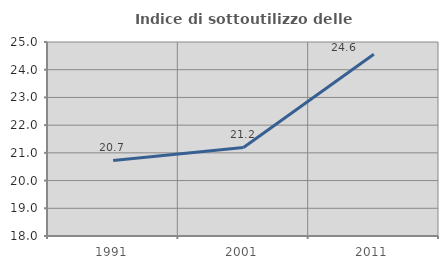
| Category | Indice di sottoutilizzo delle abitazioni  |
|---|---|
| 1991.0 | 20.727 |
| 2001.0 | 21.194 |
| 2011.0 | 24.557 |